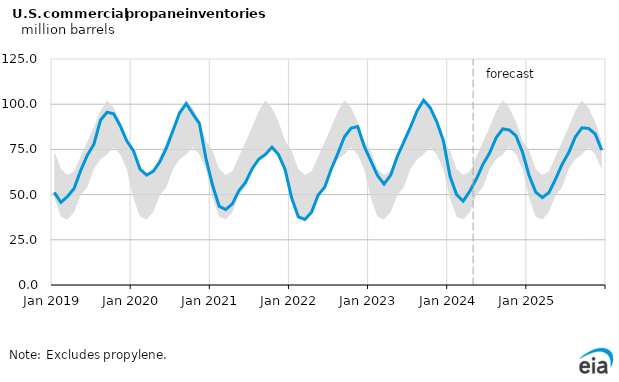
| Category | U.S propane inventories |
|---|---|
| 2019-01-01 | 51.202 |
| 2019-02-01 | 45.695 |
| 2019-03-01 | 48.929 |
| 2019-04-01 | 53.39 |
| 2019-05-01 | 63.351 |
| 2019-06-01 | 71.698 |
| 2019-07-01 | 77.807 |
| 2019-08-01 | 91.091 |
| 2019-09-01 | 95.594 |
| 2019-10-01 | 94.675 |
| 2019-11-01 | 88.094 |
| 2019-12-01 | 79.656 |
| 2020-01-01 | 74.251 |
| 2020-02-01 | 64.101 |
| 2020-03-01 | 60.81 |
| 2020-04-01 | 62.905 |
| 2020-05-01 | 68.11 |
| 2020-06-01 | 75.803 |
| 2020-07-01 | 85.443 |
| 2020-08-01 | 95.255 |
| 2020-09-01 | 100.314 |
| 2020-10-01 | 94.662 |
| 2020-11-01 | 89.388 |
| 2020-12-01 | 69.856 |
| 2021-01-01 | 55.151 |
| 2021-02-01 | 43.514 |
| 2021-03-01 | 41.745 |
| 2021-04-01 | 44.916 |
| 2021-05-01 | 52.225 |
| 2021-06-01 | 56.785 |
| 2021-07-01 | 64.31 |
| 2021-08-01 | 69.606 |
| 2021-09-01 | 72.167 |
| 2021-10-01 | 76.199 |
| 2021-11-01 | 72.115 |
| 2021-12-01 | 63.839 |
| 2022-01-01 | 48.019 |
| 2022-02-01 | 37.734 |
| 2022-03-01 | 36.266 |
| 2022-04-01 | 40.214 |
| 2022-05-01 | 49.671 |
| 2022-06-01 | 54.127 |
| 2022-07-01 | 64.161 |
| 2022-08-01 | 72.838 |
| 2022-09-01 | 81.98 |
| 2022-10-01 | 86.724 |
| 2022-11-01 | 87.672 |
| 2022-12-01 | 76.642 |
| 2023-01-01 | 68.627 |
| 2023-02-01 | 60.61 |
| 2023-03-01 | 55.831 |
| 2023-04-01 | 60.752 |
| 2023-05-01 | 71.059 |
| 2023-06-01 | 79.17 |
| 2023-07-01 | 87.327 |
| 2023-08-01 | 96.275 |
| 2023-09-01 | 102.18 |
| 2023-10-01 | 98.028 |
| 2023-11-01 | 90.236 |
| 2023-12-01 | 79.754 |
| 2024-01-01 | 60.189 |
| 2024-02-01 | 49.964 |
| 2024-03-01 | 46.41 |
| 2024-04-01 | 51.901 |
| 2024-05-01 | 58.654 |
| 2024-06-01 | 66.789 |
| 2024-07-01 | 72.963 |
| 2024-08-01 | 81.498 |
| 2024-09-01 | 86.352 |
| 2024-10-01 | 85.719 |
| 2024-11-01 | 82.532 |
| 2024-12-01 | 73.387 |
| 2025-01-01 | 60.422 |
| 2025-02-01 | 51.375 |
| 2025-03-01 | 48.357 |
| 2025-04-01 | 51.154 |
| 2025-05-01 | 58.524 |
| 2025-06-01 | 66.796 |
| 2025-07-01 | 73.24 |
| 2025-08-01 | 81.87 |
| 2025-09-01 | 86.932 |
| 2025-10-01 | 86.614 |
| 2025-11-01 | 83.619 |
| 2025-12-01 | 74.661 |